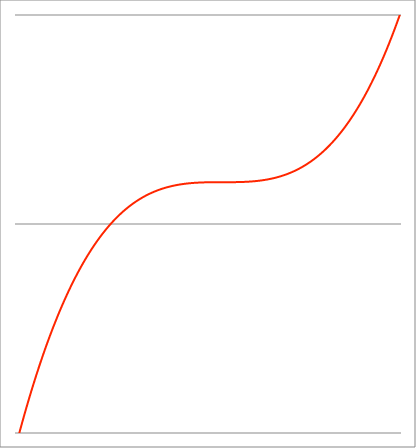
| Category | Series 1 |
|---|---|
| -1.08 | -1.06 |
| -1.07899 | -1.056 |
| -1.07798 | -1.053 |
| -1.07697 | -1.049 |
| -1.07596 | -1.046 |
| -1.07495 | -1.042 |
| -1.07394 | -1.039 |
| -1.07293 | -1.035 |
| -1.07192 | -1.032 |
| -1.07091 | -1.028 |
| -1.069900000000001 | -1.025 |
| -1.068890000000001 | -1.021 |
| -1.067880000000001 | -1.018 |
| -1.066870000000001 | -1.014 |
| -1.065860000000001 | -1.011 |
| -1.064850000000001 | -1.007 |
| -1.063840000000001 | -1.004 |
| -1.062830000000001 | -1.001 |
| -1.061820000000001 | -0.997 |
| -1.060810000000001 | -0.994 |
| -1.059800000000001 | -0.99 |
| -1.058790000000001 | -0.987 |
| -1.057780000000001 | -0.984 |
| -1.056770000000001 | -0.98 |
| -1.055760000000001 | -0.977 |
| -1.054750000000001 | -0.973 |
| -1.053740000000001 | -0.97 |
| -1.052730000000001 | -0.967 |
| -1.051720000000001 | -0.963 |
| -1.050710000000001 | -0.96 |
| -1.049700000000001 | -0.957 |
| -1.048690000000001 | -0.953 |
| -1.047680000000001 | -0.95 |
| -1.046670000000002 | -0.947 |
| -1.045660000000002 | -0.943 |
| -1.044650000000002 | -0.94 |
| -1.043640000000002 | -0.937 |
| -1.042630000000002 | -0.933 |
| -1.041620000000002 | -0.93 |
| -1.040610000000002 | -0.927 |
| -1.039600000000002 | -0.924 |
| -1.038590000000002 | -0.92 |
| -1.037580000000002 | -0.917 |
| -1.036570000000002 | -0.914 |
| -1.035560000000002 | -0.911 |
| -1.034550000000002 | -0.907 |
| -1.033540000000002 | -0.904 |
| -1.032530000000002 | -0.901 |
| -1.031520000000002 | -0.898 |
| -1.030510000000002 | -0.894 |
| -1.029500000000002 | -0.891 |
| -1.028490000000002 | -0.888 |
| -1.027480000000002 | -0.885 |
| -1.026470000000002 | -0.882 |
| -1.025460000000002 | -0.878 |
| -1.024450000000003 | -0.875 |
| -1.023440000000003 | -0.872 |
| -1.022430000000003 | -0.869 |
| -1.021420000000003 | -0.866 |
| -1.020410000000003 | -0.862 |
| -1.019400000000003 | -0.859 |
| -1.018390000000003 | -0.856 |
| -1.017380000000003 | -0.853 |
| -1.016370000000003 | -0.85 |
| -1.015360000000003 | -0.847 |
| -1.014350000000003 | -0.844 |
| -1.013340000000003 | -0.841 |
| -1.012330000000003 | -0.837 |
| -1.011320000000003 | -0.834 |
| -1.010310000000003 | -0.831 |
| -1.009300000000003 | -0.828 |
| -1.008290000000003 | -0.825 |
| -1.007280000000003 | -0.822 |
| -1.006270000000003 | -0.819 |
| -1.005260000000003 | -0.816 |
| -1.004250000000003 | -0.813 |
| -1.003240000000003 | -0.81 |
| -1.002230000000004 | -0.807 |
| -1.001220000000004 | -0.804 |
| -1.000210000000004 | -0.801 |
| -0.999200000000004 | -0.798 |
| -0.998190000000004 | -0.795 |
| -0.997180000000004 | -0.792 |
| -0.996170000000004 | -0.789 |
| -0.995160000000004 | -0.786 |
| -0.994150000000004 | -0.783 |
| -0.993140000000004 | -0.78 |
| -0.992130000000004 | -0.777 |
| -0.991120000000004 | -0.774 |
| -0.990110000000004 | -0.771 |
| -0.989100000000004 | -0.768 |
| -0.988090000000004 | -0.765 |
| -0.987080000000004 | -0.762 |
| -0.986070000000004 | -0.759 |
| -0.985060000000004 | -0.756 |
| -0.984050000000004 | -0.753 |
| -0.983040000000004 | -0.75 |
| -0.982030000000004 | -0.747 |
| -0.981020000000004 | -0.744 |
| -0.980010000000004 | -0.741 |
| -0.979000000000005 | -0.738 |
| -0.977990000000005 | -0.735 |
| -0.976980000000005 | -0.733 |
| -0.975970000000005 | -0.73 |
| -0.974960000000005 | -0.727 |
| -0.973950000000005 | -0.724 |
| -0.972940000000005 | -0.721 |
| -0.971930000000005 | -0.718 |
| -0.970920000000005 | -0.715 |
| -0.969910000000005 | -0.712 |
| -0.968900000000005 | -0.71 |
| -0.967890000000005 | -0.707 |
| -0.966880000000005 | -0.704 |
| -0.965870000000005 | -0.701 |
| -0.964860000000005 | -0.698 |
| -0.963850000000005 | -0.695 |
| -0.962840000000005 | -0.693 |
| -0.961830000000005 | -0.69 |
| -0.960820000000005 | -0.687 |
| -0.959810000000005 | -0.684 |
| -0.958800000000005 | -0.681 |
| -0.957790000000005 | -0.679 |
| -0.956780000000005 | -0.676 |
| -0.955770000000006 | -0.673 |
| -0.954760000000006 | -0.67 |
| -0.953750000000006 | -0.668 |
| -0.952740000000006 | -0.665 |
| -0.951730000000006 | -0.662 |
| -0.950720000000006 | -0.659 |
| -0.949710000000006 | -0.657 |
| -0.948700000000006 | -0.654 |
| -0.947690000000006 | -0.651 |
| -0.946680000000006 | -0.648 |
| -0.945670000000006 | -0.646 |
| -0.944660000000006 | -0.643 |
| -0.943650000000006 | -0.64 |
| -0.942640000000006 | -0.638 |
| -0.941630000000006 | -0.635 |
| -0.940620000000006 | -0.632 |
| -0.939610000000006 | -0.63 |
| -0.938600000000006 | -0.627 |
| -0.937590000000006 | -0.624 |
| -0.936580000000006 | -0.622 |
| -0.935570000000006 | -0.619 |
| -0.934560000000006 | -0.616 |
| -0.933550000000007 | -0.614 |
| -0.932540000000007 | -0.611 |
| -0.931530000000007 | -0.608 |
| -0.930520000000007 | -0.606 |
| -0.929510000000007 | -0.603 |
| -0.928500000000007 | -0.6 |
| -0.927490000000007 | -0.598 |
| -0.926480000000007 | -0.595 |
| -0.925470000000007 | -0.593 |
| -0.924460000000007 | -0.59 |
| -0.923450000000007 | -0.587 |
| -0.922440000000007 | -0.585 |
| -0.921430000000007 | -0.582 |
| -0.920420000000007 | -0.58 |
| -0.919410000000007 | -0.577 |
| -0.918400000000007 | -0.575 |
| -0.917390000000007 | -0.572 |
| -0.916380000000007 | -0.57 |
| -0.915370000000007 | -0.567 |
| -0.914360000000007 | -0.564 |
| -0.913350000000007 | -0.562 |
| -0.912340000000007 | -0.559 |
| -0.911330000000007 | -0.557 |
| -0.910320000000008 | -0.554 |
| -0.909310000000008 | -0.552 |
| -0.908300000000008 | -0.549 |
| -0.907290000000008 | -0.547 |
| -0.906280000000008 | -0.544 |
| -0.905270000000008 | -0.542 |
| -0.904260000000008 | -0.539 |
| -0.903250000000008 | -0.537 |
| -0.902240000000008 | -0.534 |
| -0.901230000000008 | -0.532 |
| -0.900220000000008 | -0.53 |
| -0.899210000000008 | -0.527 |
| -0.898200000000008 | -0.525 |
| -0.897190000000008 | -0.522 |
| -0.896180000000008 | -0.52 |
| -0.895170000000008 | -0.517 |
| -0.894160000000008 | -0.515 |
| -0.893150000000008 | -0.512 |
| -0.892140000000008 | -0.51 |
| -0.891130000000008 | -0.508 |
| -0.890120000000008 | -0.505 |
| -0.889110000000008 | -0.503 |
| -0.888100000000008 | -0.5 |
| -0.887090000000009 | -0.498 |
| -0.886080000000009 | -0.496 |
| -0.885070000000009 | -0.493 |
| -0.884060000000009 | -0.491 |
| -0.883050000000009 | -0.489 |
| -0.882040000000009 | -0.486 |
| -0.881030000000009 | -0.484 |
| -0.880020000000009 | -0.482 |
| -0.879010000000009 | -0.479 |
| -0.878000000000009 | -0.477 |
| -0.876990000000009 | -0.475 |
| -0.875980000000009 | -0.472 |
| -0.874970000000009 | -0.47 |
| -0.873960000000009 | -0.468 |
| -0.872950000000009 | -0.465 |
| -0.871940000000009 | -0.463 |
| -0.870930000000009 | -0.461 |
| -0.869920000000009 | -0.458 |
| -0.868910000000009 | -0.456 |
| -0.867900000000009 | -0.454 |
| -0.866890000000009 | -0.451 |
| -0.865880000000009 | -0.449 |
| -0.86487000000001 | -0.447 |
| -0.86386000000001 | -0.445 |
| -0.86285000000001 | -0.442 |
| -0.86184000000001 | -0.44 |
| -0.86083000000001 | -0.438 |
| -0.85982000000001 | -0.436 |
| -0.85881000000001 | -0.433 |
| -0.85780000000001 | -0.431 |
| -0.85679000000001 | -0.429 |
| -0.85578000000001 | -0.427 |
| -0.85477000000001 | -0.425 |
| -0.85376000000001 | -0.422 |
| -0.85275000000001 | -0.42 |
| -0.85174000000001 | -0.418 |
| -0.85073000000001 | -0.416 |
| -0.84972000000001 | -0.414 |
| -0.84871000000001 | -0.411 |
| -0.84770000000001 | -0.409 |
| -0.84669000000001 | -0.407 |
| -0.84568000000001 | -0.405 |
| -0.84467000000001 | -0.403 |
| -0.84366000000001 | -0.4 |
| -0.842650000000011 | -0.398 |
| -0.841640000000011 | -0.396 |
| -0.840630000000011 | -0.394 |
| -0.839620000000011 | -0.392 |
| -0.838610000000011 | -0.39 |
| -0.837600000000011 | -0.388 |
| -0.836590000000011 | -0.386 |
| -0.835580000000011 | -0.383 |
| -0.834570000000011 | -0.381 |
| -0.833560000000011 | -0.379 |
| -0.832550000000011 | -0.377 |
| -0.831540000000011 | -0.375 |
| -0.830530000000011 | -0.373 |
| -0.829520000000011 | -0.371 |
| -0.828510000000011 | -0.369 |
| -0.827500000000011 | -0.367 |
| -0.826490000000011 | -0.365 |
| -0.825480000000011 | -0.362 |
| -0.824470000000011 | -0.36 |
| -0.823460000000011 | -0.358 |
| -0.822450000000011 | -0.356 |
| -0.821440000000011 | -0.354 |
| -0.820430000000011 | -0.352 |
| -0.819420000000012 | -0.35 |
| -0.818410000000012 | -0.348 |
| -0.817400000000012 | -0.346 |
| -0.816390000000012 | -0.344 |
| -0.815380000000012 | -0.342 |
| -0.814370000000012 | -0.34 |
| -0.813360000000012 | -0.338 |
| -0.812350000000012 | -0.336 |
| -0.811340000000012 | -0.334 |
| -0.810330000000012 | -0.332 |
| -0.809320000000012 | -0.33 |
| -0.808310000000012 | -0.328 |
| -0.807300000000012 | -0.326 |
| -0.806290000000012 | -0.324 |
| -0.805280000000012 | -0.322 |
| -0.804270000000012 | -0.32 |
| -0.803260000000012 | -0.318 |
| -0.802250000000012 | -0.316 |
| -0.801240000000012 | -0.314 |
| -0.800230000000012 | -0.312 |
| -0.799220000000012 | -0.311 |
| -0.798210000000012 | -0.309 |
| -0.797200000000012 | -0.307 |
| -0.796190000000013 | -0.305 |
| -0.795180000000013 | -0.303 |
| -0.794170000000013 | -0.301 |
| -0.793160000000013 | -0.299 |
| -0.792150000000013 | -0.297 |
| -0.791140000000013 | -0.295 |
| -0.790130000000013 | -0.293 |
| -0.789120000000013 | -0.291 |
| -0.788110000000013 | -0.29 |
| -0.787100000000013 | -0.288 |
| -0.786090000000013 | -0.286 |
| -0.785080000000013 | -0.284 |
| -0.784070000000013 | -0.282 |
| -0.783060000000013 | -0.28 |
| -0.782050000000013 | -0.278 |
| -0.781040000000013 | -0.276 |
| -0.780030000000013 | -0.275 |
| -0.779020000000013 | -0.273 |
| -0.778010000000013 | -0.271 |
| -0.777000000000013 | -0.269 |
| -0.775990000000013 | -0.267 |
| -0.774980000000013 | -0.265 |
| -0.773970000000014 | -0.264 |
| -0.772960000000014 | -0.262 |
| -0.771950000000014 | -0.26 |
| -0.770940000000014 | -0.258 |
| -0.769930000000014 | -0.256 |
| -0.768920000000014 | -0.255 |
| -0.767910000000014 | -0.253 |
| -0.766900000000014 | -0.251 |
| -0.765890000000014 | -0.249 |
| -0.764880000000014 | -0.247 |
| -0.763870000000014 | -0.246 |
| -0.762860000000014 | -0.244 |
| -0.761850000000014 | -0.242 |
| -0.760840000000014 | -0.24 |
| -0.759830000000014 | -0.239 |
| -0.758820000000014 | -0.237 |
| -0.757810000000014 | -0.235 |
| -0.756800000000014 | -0.233 |
| -0.755790000000014 | -0.232 |
| -0.754780000000014 | -0.23 |
| -0.753770000000014 | -0.228 |
| -0.752760000000014 | -0.227 |
| -0.751750000000014 | -0.225 |
| -0.750740000000015 | -0.223 |
| -0.749730000000015 | -0.221 |
| -0.748720000000015 | -0.22 |
| -0.747710000000015 | -0.218 |
| -0.746700000000015 | -0.216 |
| -0.745690000000015 | -0.215 |
| -0.744680000000015 | -0.213 |
| -0.743670000000015 | -0.211 |
| -0.742660000000015 | -0.21 |
| -0.741650000000015 | -0.208 |
| -0.740640000000015 | -0.206 |
| -0.739630000000015 | -0.205 |
| -0.738620000000015 | -0.203 |
| -0.737610000000015 | -0.201 |
| -0.736600000000015 | -0.2 |
| -0.735590000000015 | -0.198 |
| -0.734580000000015 | -0.196 |
| -0.733570000000015 | -0.195 |
| -0.732560000000015 | -0.193 |
| -0.731550000000015 | -0.192 |
| -0.730540000000015 | -0.19 |
| -0.729530000000015 | -0.188 |
| -0.728520000000016 | -0.187 |
| -0.727510000000016 | -0.185 |
| -0.726500000000016 | -0.183 |
| -0.725490000000016 | -0.182 |
| -0.724480000000016 | -0.18 |
| -0.723470000000016 | -0.179 |
| -0.722460000000016 | -0.177 |
| -0.721450000000016 | -0.176 |
| -0.720440000000016 | -0.174 |
| -0.719430000000016 | -0.172 |
| -0.718420000000016 | -0.171 |
| -0.717410000000016 | -0.169 |
| -0.716400000000016 | -0.168 |
| -0.715390000000016 | -0.166 |
| -0.714380000000016 | -0.165 |
| -0.713370000000016 | -0.163 |
| -0.712360000000016 | -0.161 |
| -0.711350000000016 | -0.16 |
| -0.710340000000016 | -0.158 |
| -0.709330000000016 | -0.157 |
| -0.708320000000016 | -0.155 |
| -0.707310000000016 | -0.154 |
| -0.706300000000017 | -0.152 |
| -0.705290000000017 | -0.151 |
| -0.704280000000017 | -0.149 |
| -0.703270000000017 | -0.148 |
| -0.702260000000017 | -0.146 |
| -0.701250000000017 | -0.145 |
| -0.700240000000017 | -0.143 |
| -0.699230000000017 | -0.142 |
| -0.698220000000017 | -0.14 |
| -0.697210000000017 | -0.139 |
| -0.696200000000017 | -0.137 |
| -0.695190000000017 | -0.136 |
| -0.694180000000017 | -0.135 |
| -0.693170000000017 | -0.133 |
| -0.692160000000017 | -0.132 |
| -0.691150000000017 | -0.13 |
| -0.690140000000017 | -0.129 |
| -0.689130000000017 | -0.127 |
| -0.688120000000017 | -0.126 |
| -0.687110000000017 | -0.124 |
| -0.686100000000017 | -0.123 |
| -0.685090000000017 | -0.122 |
| -0.684080000000017 | -0.12 |
| -0.683070000000018 | -0.119 |
| -0.682060000000018 | -0.117 |
| -0.681050000000018 | -0.116 |
| -0.680040000000018 | -0.114 |
| -0.679030000000018 | -0.113 |
| -0.678020000000018 | -0.112 |
| -0.677010000000018 | -0.11 |
| -0.676000000000018 | -0.109 |
| -0.674990000000018 | -0.108 |
| -0.673980000000018 | -0.106 |
| -0.672970000000018 | -0.105 |
| -0.671960000000018 | -0.103 |
| -0.670950000000018 | -0.102 |
| -0.669940000000018 | -0.101 |
| -0.668930000000018 | -0.099 |
| -0.667920000000018 | -0.098 |
| -0.666910000000018 | -0.097 |
| -0.665900000000018 | -0.095 |
| -0.664890000000018 | -0.094 |
| -0.663880000000018 | -0.093 |
| -0.662870000000018 | -0.091 |
| -0.661860000000018 | -0.09 |
| -0.660850000000018 | -0.089 |
| -0.659840000000019 | -0.087 |
| -0.658830000000019 | -0.086 |
| -0.657820000000019 | -0.085 |
| -0.656810000000019 | -0.083 |
| -0.655800000000019 | -0.082 |
| -0.654790000000019 | -0.081 |
| -0.653780000000019 | -0.079 |
| -0.652770000000019 | -0.078 |
| -0.651760000000019 | -0.077 |
| -0.650750000000019 | -0.076 |
| -0.649740000000019 | -0.074 |
| -0.648730000000019 | -0.073 |
| -0.647720000000019 | -0.072 |
| -0.646710000000019 | -0.07 |
| -0.645700000000019 | -0.069 |
| -0.644690000000019 | -0.068 |
| -0.643680000000019 | -0.067 |
| -0.642670000000019 | -0.065 |
| -0.641660000000019 | -0.064 |
| -0.640650000000019 | -0.063 |
| -0.639640000000019 | -0.062 |
| -0.638630000000019 | -0.06 |
| -0.63762000000002 | -0.059 |
| -0.63661000000002 | -0.058 |
| -0.63560000000002 | -0.057 |
| -0.63459000000002 | -0.056 |
| -0.63358000000002 | -0.054 |
| -0.63257000000002 | -0.053 |
| -0.63156000000002 | -0.052 |
| -0.63055000000002 | -0.051 |
| -0.62954000000002 | -0.049 |
| -0.62853000000002 | -0.048 |
| -0.62752000000002 | -0.047 |
| -0.62651000000002 | -0.046 |
| -0.62550000000002 | -0.045 |
| -0.62449000000002 | -0.044 |
| -0.62348000000002 | -0.042 |
| -0.62247000000002 | -0.041 |
| -0.62146000000002 | -0.04 |
| -0.62045000000002 | -0.039 |
| -0.61944000000002 | -0.038 |
| -0.61843000000002 | -0.037 |
| -0.61742000000002 | -0.035 |
| -0.61641000000002 | -0.034 |
| -0.615400000000021 | -0.033 |
| -0.614390000000021 | -0.032 |
| -0.613380000000021 | -0.031 |
| -0.612370000000021 | -0.03 |
| -0.611360000000021 | -0.029 |
| -0.610350000000021 | -0.027 |
| -0.609340000000021 | -0.026 |
| -0.608330000000021 | -0.025 |
| -0.607320000000021 | -0.024 |
| -0.606310000000021 | -0.023 |
| -0.605300000000021 | -0.022 |
| -0.604290000000021 | -0.021 |
| -0.603280000000021 | -0.02 |
| -0.602270000000021 | -0.018 |
| -0.601260000000021 | -0.017 |
| -0.600250000000021 | -0.016 |
| -0.599240000000021 | -0.015 |
| -0.598230000000021 | -0.014 |
| -0.597220000000021 | -0.013 |
| -0.596210000000021 | -0.012 |
| -0.595200000000021 | -0.011 |
| -0.594190000000022 | -0.01 |
| -0.593180000000022 | -0.009 |
| -0.592170000000022 | -0.008 |
| -0.591160000000022 | -0.007 |
| -0.590150000000022 | -0.006 |
| -0.589140000000022 | -0.004 |
| -0.588130000000022 | -0.003 |
| -0.587120000000022 | -0.002 |
| -0.586110000000022 | -0.001 |
| -0.585100000000022 | 0 |
| -0.584090000000022 | 0.001 |
| -0.583080000000022 | 0.002 |
| -0.582070000000022 | 0.003 |
| -0.581060000000022 | 0.004 |
| -0.580050000000022 | 0.005 |
| -0.579040000000022 | 0.006 |
| -0.578030000000022 | 0.007 |
| -0.577020000000022 | 0.008 |
| -0.576010000000022 | 0.009 |
| -0.575000000000022 | 0.01 |
| -0.573990000000022 | 0.011 |
| -0.572980000000022 | 0.012 |
| -0.571970000000023 | 0.013 |
| -0.570960000000023 | 0.014 |
| -0.569950000000023 | 0.015 |
| -0.568940000000023 | 0.016 |
| -0.567930000000023 | 0.017 |
| -0.566920000000023 | 0.018 |
| -0.565910000000023 | 0.019 |
| -0.564900000000023 | 0.02 |
| -0.563890000000023 | 0.021 |
| -0.562880000000023 | 0.022 |
| -0.561870000000023 | 0.023 |
| -0.560860000000023 | 0.024 |
| -0.559850000000023 | 0.025 |
| -0.558840000000023 | 0.025 |
| -0.557830000000023 | 0.026 |
| -0.556820000000023 | 0.027 |
| -0.555810000000023 | 0.028 |
| -0.554800000000023 | 0.029 |
| -0.553790000000023 | 0.03 |
| -0.552780000000023 | 0.031 |
| -0.551770000000023 | 0.032 |
| -0.550760000000023 | 0.033 |
| -0.549750000000023 | 0.034 |
| -0.548740000000024 | 0.035 |
| -0.547730000000024 | 0.036 |
| -0.546720000000024 | 0.037 |
| -0.545710000000024 | 0.037 |
| -0.544700000000024 | 0.038 |
| -0.543690000000024 | 0.039 |
| -0.542680000000024 | 0.04 |
| -0.541670000000024 | 0.041 |
| -0.540660000000024 | 0.042 |
| -0.539650000000024 | 0.043 |
| -0.538640000000024 | 0.044 |
| -0.537630000000024 | 0.045 |
| -0.536620000000024 | 0.045 |
| -0.535610000000024 | 0.046 |
| -0.534600000000024 | 0.047 |
| -0.533590000000024 | 0.048 |
| -0.532580000000024 | 0.049 |
| -0.531570000000024 | 0.05 |
| -0.530560000000024 | 0.051 |
| -0.529550000000024 | 0.052 |
| -0.528540000000024 | 0.052 |
| -0.527530000000024 | 0.053 |
| -0.526520000000025 | 0.054 |
| -0.525510000000025 | 0.055 |
| -0.524500000000025 | 0.056 |
| -0.523490000000025 | 0.057 |
| -0.522480000000025 | 0.057 |
| -0.521470000000025 | 0.058 |
| -0.520460000000025 | 0.059 |
| -0.519450000000025 | 0.06 |
| -0.518440000000025 | 0.061 |
| -0.517430000000025 | 0.061 |
| -0.516420000000025 | 0.062 |
| -0.515410000000025 | 0.063 |
| -0.514400000000025 | 0.064 |
| -0.513390000000025 | 0.065 |
| -0.512380000000025 | 0.065 |
| -0.511370000000025 | 0.066 |
| -0.510360000000025 | 0.067 |
| -0.509350000000025 | 0.068 |
| -0.508340000000025 | 0.069 |
| -0.507330000000025 | 0.069 |
| -0.506320000000025 | 0.07 |
| -0.505310000000025 | 0.071 |
| -0.504300000000026 | 0.072 |
| -0.503290000000026 | 0.073 |
| -0.502280000000026 | 0.073 |
| -0.501270000000026 | 0.074 |
| -0.500260000000026 | 0.075 |
| -0.499250000000026 | 0.076 |
| -0.498240000000026 | 0.076 |
| -0.497230000000026 | 0.077 |
| -0.496220000000026 | 0.078 |
| -0.495210000000026 | 0.079 |
| -0.494200000000026 | 0.079 |
| -0.493190000000026 | 0.08 |
| -0.492180000000026 | 0.081 |
| -0.491170000000026 | 0.082 |
| -0.490160000000026 | 0.082 |
| -0.489150000000026 | 0.083 |
| -0.488140000000026 | 0.084 |
| -0.487130000000026 | 0.084 |
| -0.486120000000025 | 0.085 |
| -0.485110000000025 | 0.086 |
| -0.484100000000025 | 0.087 |
| -0.483090000000025 | 0.087 |
| -0.482080000000025 | 0.088 |
| -0.481070000000025 | 0.089 |
| -0.480060000000025 | 0.089 |
| -0.479050000000025 | 0.09 |
| -0.478040000000025 | 0.091 |
| -0.477030000000025 | 0.091 |
| -0.476020000000025 | 0.092 |
| -0.475010000000025 | 0.093 |
| -0.474000000000025 | 0.094 |
| -0.472990000000025 | 0.094 |
| -0.471980000000025 | 0.095 |
| -0.470970000000025 | 0.096 |
| -0.469960000000025 | 0.096 |
| -0.468950000000025 | 0.097 |
| -0.467940000000025 | 0.098 |
| -0.466930000000025 | 0.098 |
| -0.465920000000025 | 0.099 |
| -0.464910000000025 | 0.1 |
| -0.463900000000025 | 0.1 |
| -0.462890000000025 | 0.101 |
| -0.461880000000025 | 0.101 |
| -0.460870000000025 | 0.102 |
| -0.459860000000025 | 0.103 |
| -0.458850000000025 | 0.103 |
| -0.457840000000025 | 0.104 |
| -0.456830000000025 | 0.105 |
| -0.455820000000025 | 0.105 |
| -0.454810000000025 | 0.106 |
| -0.453800000000025 | 0.107 |
| -0.452790000000025 | 0.107 |
| -0.451780000000025 | 0.108 |
| -0.450770000000025 | 0.108 |
| -0.449760000000025 | 0.109 |
| -0.448750000000025 | 0.11 |
| -0.447740000000025 | 0.11 |
| -0.446730000000025 | 0.111 |
| -0.445720000000025 | 0.111 |
| -0.444710000000025 | 0.112 |
| -0.443700000000025 | 0.113 |
| -0.442690000000025 | 0.113 |
| -0.441680000000025 | 0.114 |
| -0.440670000000025 | 0.114 |
| -0.439660000000025 | 0.115 |
| -0.438650000000025 | 0.116 |
| -0.437640000000025 | 0.116 |
| -0.436630000000025 | 0.117 |
| -0.435620000000025 | 0.117 |
| -0.434610000000025 | 0.118 |
| -0.433600000000025 | 0.118 |
| -0.432590000000025 | 0.119 |
| -0.431580000000025 | 0.12 |
| -0.430570000000025 | 0.12 |
| -0.429560000000025 | 0.121 |
| -0.428550000000025 | 0.121 |
| -0.427540000000025 | 0.122 |
| -0.426530000000025 | 0.122 |
| -0.425520000000025 | 0.123 |
| -0.424510000000025 | 0.123 |
| -0.423500000000025 | 0.124 |
| -0.422490000000025 | 0.125 |
| -0.421480000000025 | 0.125 |
| -0.420470000000025 | 0.126 |
| -0.419460000000025 | 0.126 |
| -0.418450000000025 | 0.127 |
| -0.417440000000025 | 0.127 |
| -0.416430000000025 | 0.128 |
| -0.415420000000025 | 0.128 |
| -0.414410000000025 | 0.129 |
| -0.413400000000025 | 0.129 |
| -0.412390000000025 | 0.13 |
| -0.411380000000025 | 0.13 |
| -0.410370000000025 | 0.131 |
| -0.409360000000025 | 0.131 |
| -0.408350000000025 | 0.132 |
| -0.407340000000025 | 0.132 |
| -0.406330000000025 | 0.133 |
| -0.405320000000025 | 0.133 |
| -0.404310000000025 | 0.134 |
| -0.403300000000025 | 0.134 |
| -0.402290000000025 | 0.135 |
| -0.401280000000025 | 0.135 |
| -0.400270000000025 | 0.136 |
| -0.399260000000025 | 0.136 |
| -0.398250000000025 | 0.137 |
| -0.397240000000025 | 0.137 |
| -0.396230000000024 | 0.138 |
| -0.395220000000024 | 0.138 |
| -0.394210000000024 | 0.139 |
| -0.393200000000024 | 0.139 |
| -0.392190000000024 | 0.14 |
| -0.391180000000024 | 0.14 |
| -0.390170000000024 | 0.141 |
| -0.389160000000024 | 0.141 |
| -0.388150000000024 | 0.142 |
| -0.387140000000024 | 0.142 |
| -0.386130000000024 | 0.142 |
| -0.385120000000024 | 0.143 |
| -0.384110000000024 | 0.143 |
| -0.383100000000024 | 0.144 |
| -0.382090000000024 | 0.144 |
| -0.381080000000024 | 0.145 |
| -0.380070000000024 | 0.145 |
| -0.379060000000024 | 0.146 |
| -0.378050000000024 | 0.146 |
| -0.377040000000024 | 0.146 |
| -0.376030000000024 | 0.147 |
| -0.375020000000024 | 0.147 |
| -0.374010000000024 | 0.148 |
| -0.373000000000024 | 0.148 |
| -0.371990000000024 | 0.149 |
| -0.370980000000024 | 0.149 |
| -0.369970000000024 | 0.149 |
| -0.368960000000024 | 0.15 |
| -0.367950000000024 | 0.15 |
| -0.366940000000024 | 0.151 |
| -0.365930000000024 | 0.151 |
| -0.364920000000024 | 0.151 |
| -0.363910000000024 | 0.152 |
| -0.362900000000024 | 0.152 |
| -0.361890000000024 | 0.153 |
| -0.360880000000024 | 0.153 |
| -0.359870000000024 | 0.153 |
| -0.358860000000024 | 0.154 |
| -0.357850000000024 | 0.154 |
| -0.356840000000024 | 0.155 |
| -0.355830000000024 | 0.155 |
| -0.354820000000024 | 0.155 |
| -0.353810000000024 | 0.156 |
| -0.352800000000024 | 0.156 |
| -0.351790000000024 | 0.156 |
| -0.350780000000024 | 0.157 |
| -0.349770000000024 | 0.157 |
| -0.348760000000024 | 0.158 |
| -0.347750000000024 | 0.158 |
| -0.346740000000024 | 0.158 |
| -0.345730000000024 | 0.159 |
| -0.344720000000024 | 0.159 |
| -0.343710000000024 | 0.159 |
| -0.342700000000024 | 0.16 |
| -0.341690000000024 | 0.16 |
| -0.340680000000024 | 0.16 |
| -0.339670000000024 | 0.161 |
| -0.338660000000024 | 0.161 |
| -0.337650000000024 | 0.162 |
| -0.336640000000024 | 0.162 |
| -0.335630000000024 | 0.162 |
| -0.334620000000024 | 0.163 |
| -0.333610000000024 | 0.163 |
| -0.332600000000024 | 0.163 |
| -0.331590000000024 | 0.164 |
| -0.330580000000024 | 0.164 |
| -0.329570000000024 | 0.164 |
| -0.328560000000024 | 0.165 |
| -0.327550000000024 | 0.165 |
| -0.326540000000024 | 0.165 |
| -0.325530000000024 | 0.166 |
| -0.324520000000024 | 0.166 |
| -0.323510000000024 | 0.166 |
| -0.322500000000024 | 0.166 |
| -0.321490000000024 | 0.167 |
| -0.320480000000024 | 0.167 |
| -0.319470000000024 | 0.167 |
| -0.318460000000024 | 0.168 |
| -0.317450000000024 | 0.168 |
| -0.316440000000024 | 0.168 |
| -0.315430000000024 | 0.169 |
| -0.314420000000024 | 0.169 |
| -0.313410000000024 | 0.169 |
| -0.312400000000024 | 0.17 |
| -0.311390000000024 | 0.17 |
| -0.310380000000024 | 0.17 |
| -0.309370000000024 | 0.17 |
| -0.308360000000024 | 0.171 |
| -0.307350000000024 | 0.171 |
| -0.306340000000024 | 0.171 |
| -0.305330000000024 | 0.172 |
| -0.304320000000024 | 0.172 |
| -0.303310000000024 | 0.172 |
| -0.302300000000024 | 0.172 |
| -0.301290000000023 | 0.173 |
| -0.300280000000023 | 0.173 |
| -0.299270000000023 | 0.173 |
| -0.298260000000023 | 0.173 |
| -0.297250000000023 | 0.174 |
| -0.296240000000023 | 0.174 |
| -0.295230000000023 | 0.174 |
| -0.294220000000023 | 0.175 |
| -0.293210000000023 | 0.175 |
| -0.292200000000023 | 0.175 |
| -0.291190000000023 | 0.175 |
| -0.290180000000023 | 0.176 |
| -0.289170000000023 | 0.176 |
| -0.288160000000023 | 0.176 |
| -0.287150000000023 | 0.176 |
| -0.286140000000023 | 0.177 |
| -0.285130000000023 | 0.177 |
| -0.284120000000023 | 0.177 |
| -0.283110000000023 | 0.177 |
| -0.282100000000023 | 0.178 |
| -0.281090000000023 | 0.178 |
| -0.280080000000023 | 0.178 |
| -0.279070000000023 | 0.178 |
| -0.278060000000023 | 0.179 |
| -0.277050000000023 | 0.179 |
| -0.276040000000023 | 0.179 |
| -0.275030000000023 | 0.179 |
| -0.274020000000023 | 0.179 |
| -0.273010000000023 | 0.18 |
| -0.272000000000023 | 0.18 |
| -0.270990000000023 | 0.18 |
| -0.269980000000023 | 0.18 |
| -0.268970000000023 | 0.181 |
| -0.267960000000023 | 0.181 |
| -0.266950000000023 | 0.181 |
| -0.265940000000023 | 0.181 |
| -0.264930000000023 | 0.181 |
| -0.263920000000023 | 0.182 |
| -0.262910000000023 | 0.182 |
| -0.261900000000023 | 0.182 |
| -0.260890000000023 | 0.182 |
| -0.259880000000023 | 0.182 |
| -0.258870000000023 | 0.183 |
| -0.257860000000023 | 0.183 |
| -0.256850000000023 | 0.183 |
| -0.255840000000023 | 0.183 |
| -0.254830000000023 | 0.183 |
| -0.253820000000023 | 0.184 |
| -0.252810000000023 | 0.184 |
| -0.251800000000023 | 0.184 |
| -0.250790000000023 | 0.184 |
| -0.249780000000023 | 0.184 |
| -0.248770000000023 | 0.185 |
| -0.247760000000023 | 0.185 |
| -0.246750000000023 | 0.185 |
| -0.245740000000023 | 0.185 |
| -0.244730000000023 | 0.185 |
| -0.243720000000023 | 0.186 |
| -0.242710000000023 | 0.186 |
| -0.241700000000023 | 0.186 |
| -0.240690000000023 | 0.186 |
| -0.239680000000023 | 0.186 |
| -0.238670000000023 | 0.186 |
| -0.237660000000023 | 0.187 |
| -0.236650000000023 | 0.187 |
| -0.235640000000023 | 0.187 |
| -0.234630000000023 | 0.187 |
| -0.233620000000023 | 0.187 |
| -0.232610000000023 | 0.187 |
| -0.231600000000023 | 0.188 |
| -0.230590000000023 | 0.188 |
| -0.229580000000023 | 0.188 |
| -0.228570000000023 | 0.188 |
| -0.227560000000023 | 0.188 |
| -0.226550000000023 | 0.188 |
| -0.225540000000023 | 0.189 |
| -0.224530000000023 | 0.189 |
| -0.223520000000023 | 0.189 |
| -0.222510000000023 | 0.189 |
| -0.221500000000023 | 0.189 |
| -0.220490000000023 | 0.189 |
| -0.219480000000023 | 0.189 |
| -0.218470000000023 | 0.19 |
| -0.217460000000023 | 0.19 |
| -0.216450000000023 | 0.19 |
| -0.215440000000023 | 0.19 |
| -0.214430000000023 | 0.19 |
| -0.213420000000023 | 0.19 |
| -0.212410000000023 | 0.19 |
| -0.211400000000023 | 0.191 |
| -0.210390000000023 | 0.191 |
| -0.209380000000023 | 0.191 |
| -0.208370000000023 | 0.191 |
| -0.207360000000023 | 0.191 |
| -0.206350000000023 | 0.191 |
| -0.205340000000022 | 0.191 |
| -0.204330000000022 | 0.191 |
| -0.203320000000022 | 0.192 |
| -0.202310000000022 | 0.192 |
| -0.201300000000022 | 0.192 |
| -0.200290000000022 | 0.192 |
| -0.199280000000022 | 0.192 |
| -0.198270000000022 | 0.192 |
| -0.197260000000022 | 0.192 |
| -0.196250000000022 | 0.192 |
| -0.195240000000022 | 0.193 |
| -0.194230000000022 | 0.193 |
| -0.193220000000022 | 0.193 |
| -0.192210000000022 | 0.193 |
| -0.191200000000022 | 0.193 |
| -0.190190000000022 | 0.193 |
| -0.189180000000022 | 0.193 |
| -0.188170000000022 | 0.193 |
| -0.187160000000022 | 0.193 |
| -0.186150000000022 | 0.194 |
| -0.185140000000022 | 0.194 |
| -0.184130000000022 | 0.194 |
| -0.183120000000022 | 0.194 |
| -0.182110000000022 | 0.194 |
| -0.181100000000022 | 0.194 |
| -0.180090000000022 | 0.194 |
| -0.179080000000022 | 0.194 |
| -0.178070000000022 | 0.194 |
| -0.177060000000022 | 0.194 |
| -0.176050000000022 | 0.195 |
| -0.175040000000022 | 0.195 |
| -0.174030000000022 | 0.195 |
| -0.173020000000022 | 0.195 |
| -0.172010000000022 | 0.195 |
| -0.171000000000022 | 0.195 |
| -0.169990000000022 | 0.195 |
| -0.168980000000022 | 0.195 |
| -0.167970000000022 | 0.195 |
| -0.166960000000022 | 0.195 |
| -0.165950000000022 | 0.195 |
| -0.164940000000022 | 0.196 |
| -0.163930000000022 | 0.196 |
| -0.162920000000022 | 0.196 |
| -0.161910000000022 | 0.196 |
| -0.160900000000022 | 0.196 |
| -0.159890000000022 | 0.196 |
| -0.158880000000022 | 0.196 |
| -0.157870000000022 | 0.196 |
| -0.156860000000022 | 0.196 |
| -0.155850000000022 | 0.196 |
| -0.154840000000022 | 0.196 |
| -0.153830000000022 | 0.196 |
| -0.152820000000022 | 0.196 |
| -0.151810000000022 | 0.197 |
| -0.150800000000022 | 0.197 |
| -0.149790000000022 | 0.197 |
| -0.148780000000022 | 0.197 |
| -0.147770000000022 | 0.197 |
| -0.146760000000022 | 0.197 |
| -0.145750000000022 | 0.197 |
| -0.144740000000022 | 0.197 |
| -0.143730000000022 | 0.197 |
| -0.142720000000022 | 0.197 |
| -0.141710000000022 | 0.197 |
| -0.140700000000022 | 0.197 |
| -0.139690000000022 | 0.197 |
| -0.138680000000022 | 0.197 |
| -0.137670000000022 | 0.197 |
| -0.136660000000022 | 0.197 |
| -0.135650000000022 | 0.198 |
| -0.134640000000022 | 0.198 |
| -0.133630000000022 | 0.198 |
| -0.132620000000022 | 0.198 |
| -0.131610000000022 | 0.198 |
| -0.130600000000022 | 0.198 |
| -0.129590000000022 | 0.198 |
| -0.128580000000022 | 0.198 |
| -0.127570000000022 | 0.198 |
| -0.126560000000022 | 0.198 |
| -0.125550000000022 | 0.198 |
| -0.124540000000022 | 0.198 |
| -0.123530000000022 | 0.198 |
| -0.122520000000022 | 0.198 |
| -0.121510000000022 | 0.198 |
| -0.120500000000022 | 0.198 |
| -0.119490000000022 | 0.198 |
| -0.118480000000022 | 0.198 |
| -0.117470000000022 | 0.198 |
| -0.116460000000022 | 0.198 |
| -0.115450000000022 | 0.198 |
| -0.114440000000022 | 0.199 |
| -0.113430000000022 | 0.199 |
| -0.112420000000022 | 0.199 |
| -0.111410000000022 | 0.199 |
| -0.110400000000022 | 0.199 |
| -0.109390000000022 | 0.199 |
| -0.108380000000022 | 0.199 |
| -0.107370000000022 | 0.199 |
| -0.106360000000022 | 0.199 |
| -0.105350000000022 | 0.199 |
| -0.104340000000022 | 0.199 |
| -0.103330000000022 | 0.199 |
| -0.102320000000022 | 0.199 |
| -0.101310000000022 | 0.199 |
| -0.100300000000022 | 0.199 |
| -0.0992900000000217 | 0.199 |
| -0.0982800000000217 | 0.199 |
| -0.0972700000000217 | 0.199 |
| -0.0962600000000217 | 0.199 |
| -0.0952500000000217 | 0.199 |
| -0.0942400000000217 | 0.199 |
| -0.0932300000000217 | 0.199 |
| -0.0922200000000217 | 0.199 |
| -0.0912100000000217 | 0.199 |
| -0.0902000000000217 | 0.199 |
| -0.0891900000000217 | 0.199 |
| -0.0881800000000217 | 0.199 |
| -0.0871700000000217 | 0.199 |
| -0.0861600000000217 | 0.199 |
| -0.0851500000000217 | 0.199 |
| -0.0841400000000218 | 0.199 |
| -0.0831300000000218 | 0.199 |
| -0.0821200000000218 | 0.199 |
| -0.0811100000000218 | 0.199 |
| -0.0801000000000218 | 0.199 |
| -0.0790900000000218 | 0.2 |
| -0.0780800000000218 | 0.2 |
| -0.0770700000000218 | 0.2 |
| -0.0760600000000218 | 0.2 |
| -0.0750500000000218 | 0.2 |
| -0.0740400000000218 | 0.2 |
| -0.0730300000000218 | 0.2 |
| -0.0720200000000218 | 0.2 |
| -0.0710100000000218 | 0.2 |
| -0.0700000000000218 | 0.2 |
| -0.0689900000000218 | 0.2 |
| -0.0679800000000218 | 0.2 |
| -0.0669700000000218 | 0.2 |
| -0.0659600000000218 | 0.2 |
| -0.0649500000000218 | 0.2 |
| -0.0639400000000218 | 0.2 |
| -0.0629300000000218 | 0.2 |
| -0.0619200000000218 | 0.2 |
| -0.0609100000000218 | 0.2 |
| -0.0599000000000218 | 0.2 |
| -0.0588900000000218 | 0.2 |
| -0.0578800000000218 | 0.2 |
| -0.0568700000000218 | 0.2 |
| -0.0558600000000218 | 0.2 |
| -0.0548500000000218 | 0.2 |
| -0.0538400000000218 | 0.2 |
| -0.0528300000000218 | 0.2 |
| -0.0518200000000219 | 0.2 |
| -0.0508100000000219 | 0.2 |
| -0.0498000000000219 | 0.2 |
| -0.0487900000000219 | 0.2 |
| -0.0477800000000219 | 0.2 |
| -0.0467700000000219 | 0.2 |
| -0.0457600000000219 | 0.2 |
| -0.0447500000000219 | 0.2 |
| -0.0437400000000219 | 0.2 |
| -0.0427300000000219 | 0.2 |
| -0.0417200000000219 | 0.2 |
| -0.0407100000000219 | 0.2 |
| -0.0397000000000219 | 0.2 |
| -0.0386900000000219 | 0.2 |
| -0.0376800000000219 | 0.2 |
| -0.0366700000000219 | 0.2 |
| -0.0356600000000219 | 0.2 |
| -0.0346500000000219 | 0.2 |
| -0.0336400000000219 | 0.2 |
| -0.0326300000000219 | 0.2 |
| -0.0316200000000219 | 0.2 |
| -0.0306100000000219 | 0.2 |
| -0.0296000000000219 | 0.2 |
| -0.0285900000000219 | 0.2 |
| -0.0275800000000219 | 0.2 |
| -0.0265700000000219 | 0.2 |
| -0.0255600000000219 | 0.2 |
| -0.0245500000000219 | 0.2 |
| -0.0235400000000219 | 0.2 |
| -0.0225300000000219 | 0.2 |
| -0.0215200000000219 | 0.2 |
| -0.0205100000000219 | 0.2 |
| -0.0195000000000219 | 0.2 |
| -0.0184900000000219 | 0.2 |
| -0.0174800000000219 | 0.2 |
| -0.0164700000000219 | 0.2 |
| -0.0154600000000219 | 0.2 |
| -0.0144500000000219 | 0.2 |
| -0.0134400000000219 | 0.2 |
| -0.0124300000000219 | 0.2 |
| -0.0114200000000219 | 0.2 |
| -0.0104100000000219 | 0.2 |
| -0.00940000000002191 | 0.2 |
| -0.00839000000002191 | 0.2 |
| -0.00738000000002191 | 0.2 |
| -0.00637000000002191 | 0.2 |
| -0.00536000000002191 | 0.2 |
| -0.00435000000002191 | 0.2 |
| -0.00334000000002191 | 0.2 |
| -0.00233000000002191 | 0.2 |
| -0.00132000000002191 | 0.2 |
| -0.000310000000021909 | 0.2 |
| 0.000699999999978091 | 0.2 |
| 0.00170999999997809 | 0.2 |
| 0.00271999999997809 | 0.2 |
| 0.00372999999997809 | 0.2 |
| 0.00473999999997809 | 0.2 |
| 0.00574999999997809 | 0.2 |
| 0.00675999999997809 | 0.2 |
| 0.00776999999997809 | 0.2 |
| 0.00877999999997809 | 0.2 |
| 0.00978999999997809 | 0.2 |
| 0.0107999999999781 | 0.2 |
| 0.0118099999999781 | 0.2 |
| 0.0128199999999781 | 0.2 |
| 0.0138299999999781 | 0.2 |
| 0.0148399999999781 | 0.2 |
| 0.0158499999999781 | 0.2 |
| 0.0168599999999781 | 0.2 |
| 0.0178699999999781 | 0.2 |
| 0.0188799999999781 | 0.2 |
| 0.0198899999999781 | 0.2 |
| 0.0208999999999781 | 0.2 |
| 0.0219099999999781 | 0.2 |
| 0.0229199999999781 | 0.2 |
| 0.0239299999999781 | 0.2 |
| 0.0249399999999781 | 0.2 |
| 0.0259499999999781 | 0.2 |
| 0.0269599999999781 | 0.2 |
| 0.0279699999999781 | 0.2 |
| 0.0289799999999781 | 0.2 |
| 0.0299899999999781 | 0.2 |
| 0.0309999999999781 | 0.2 |
| 0.0320099999999781 | 0.2 |
| 0.0330199999999781 | 0.2 |
| 0.0340299999999781 | 0.2 |
| 0.0350399999999781 | 0.2 |
| 0.0360499999999781 | 0.2 |
| 0.0370599999999781 | 0.2 |
| 0.0380699999999781 | 0.2 |
| 0.0390799999999781 | 0.2 |
| 0.0400899999999781 | 0.2 |
| 0.0410999999999781 | 0.2 |
| 0.0421099999999781 | 0.2 |
| 0.0431199999999781 | 0.2 |
| 0.0441299999999781 | 0.2 |
| 0.0451399999999781 | 0.2 |
| 0.0461499999999781 | 0.2 |
| 0.0471599999999781 | 0.2 |
| 0.048169999999978 | 0.2 |
| 0.049179999999978 | 0.2 |
| 0.050189999999978 | 0.2 |
| 0.051199999999978 | 0.2 |
| 0.052209999999978 | 0.2 |
| 0.053219999999978 | 0.2 |
| 0.054229999999978 | 0.2 |
| 0.055239999999978 | 0.2 |
| 0.056249999999978 | 0.2 |
| 0.057259999999978 | 0.2 |
| 0.058269999999978 | 0.2 |
| 0.059279999999978 | 0.2 |
| 0.060289999999978 | 0.2 |
| 0.061299999999978 | 0.2 |
| 0.062309999999978 | 0.2 |
| 0.063319999999978 | 0.2 |
| 0.064329999999978 | 0.2 |
| 0.065339999999978 | 0.2 |
| 0.066349999999978 | 0.2 |
| 0.067359999999978 | 0.2 |
| 0.068369999999978 | 0.2 |
| 0.069379999999978 | 0.2 |
| 0.070389999999978 | 0.2 |
| 0.071399999999978 | 0.2 |
| 0.072409999999978 | 0.2 |
| 0.073419999999978 | 0.2 |
| 0.074429999999978 | 0.2 |
| 0.075439999999978 | 0.2 |
| 0.076449999999978 | 0.2 |
| 0.077459999999978 | 0.2 |
| 0.078469999999978 | 0.2 |
| 0.079479999999978 | 0.201 |
| 0.080489999999978 | 0.201 |
| 0.0814999999999779 | 0.201 |
| 0.0825099999999779 | 0.201 |
| 0.0835199999999779 | 0.201 |
| 0.0845299999999779 | 0.201 |
| 0.0855399999999779 | 0.201 |
| 0.0865499999999779 | 0.201 |
| 0.0875599999999779 | 0.201 |
| 0.0885699999999779 | 0.201 |
| 0.0895799999999779 | 0.201 |
| 0.0905899999999779 | 0.201 |
| 0.0915999999999779 | 0.201 |
| 0.0926099999999779 | 0.201 |
| 0.0936199999999779 | 0.201 |
| 0.0946299999999779 | 0.201 |
| 0.0956399999999779 | 0.201 |
| 0.0966499999999779 | 0.201 |
| 0.0976599999999779 | 0.201 |
| 0.0986699999999779 | 0.201 |
| 0.0996799999999779 | 0.201 |
| 0.100689999999978 | 0.201 |
| 0.101699999999978 | 0.201 |
| 0.102709999999978 | 0.201 |
| 0.103719999999978 | 0.201 |
| 0.104729999999978 | 0.201 |
| 0.105739999999978 | 0.201 |
| 0.106749999999978 | 0.201 |
| 0.107759999999978 | 0.201 |
| 0.108769999999978 | 0.201 |
| 0.109779999999978 | 0.201 |
| 0.110789999999978 | 0.201 |
| 0.111799999999978 | 0.201 |
| 0.112809999999978 | 0.201 |
| 0.113819999999978 | 0.201 |
| 0.114829999999978 | 0.202 |
| 0.115839999999978 | 0.202 |
| 0.116849999999978 | 0.202 |
| 0.117859999999978 | 0.202 |
| 0.118869999999978 | 0.202 |
| 0.119879999999978 | 0.202 |
| 0.120889999999978 | 0.202 |
| 0.121899999999978 | 0.202 |
| 0.122909999999978 | 0.202 |
| 0.123919999999978 | 0.202 |
| 0.124929999999978 | 0.202 |
| 0.125939999999978 | 0.202 |
| 0.126949999999978 | 0.202 |
| 0.127959999999978 | 0.202 |
| 0.128969999999978 | 0.202 |
| 0.129979999999978 | 0.202 |
| 0.130989999999978 | 0.202 |
| 0.131999999999978 | 0.202 |
| 0.133009999999978 | 0.202 |
| 0.134019999999978 | 0.202 |
| 0.135029999999978 | 0.202 |
| 0.136039999999978 | 0.203 |
| 0.137049999999978 | 0.203 |
| 0.138059999999978 | 0.203 |
| 0.139069999999978 | 0.203 |
| 0.140079999999978 | 0.203 |
| 0.141089999999978 | 0.203 |
| 0.142099999999978 | 0.203 |
| 0.143109999999978 | 0.203 |
| 0.144119999999978 | 0.203 |
| 0.145129999999978 | 0.203 |
| 0.146139999999978 | 0.203 |
| 0.147149999999978 | 0.203 |
| 0.148159999999978 | 0.203 |
| 0.149169999999978 | 0.203 |
| 0.150179999999978 | 0.203 |
| 0.151189999999978 | 0.203 |
| 0.152199999999978 | 0.204 |
| 0.153209999999978 | 0.204 |
| 0.154219999999978 | 0.204 |
| 0.155229999999978 | 0.204 |
| 0.156239999999978 | 0.204 |
| 0.157249999999978 | 0.204 |
| 0.158259999999978 | 0.204 |
| 0.159269999999978 | 0.204 |
| 0.160279999999978 | 0.204 |
| 0.161289999999978 | 0.204 |
| 0.162299999999978 | 0.204 |
| 0.163309999999978 | 0.204 |
| 0.164319999999978 | 0.204 |
| 0.165329999999978 | 0.205 |
| 0.166339999999978 | 0.205 |
| 0.167349999999978 | 0.205 |
| 0.168359999999978 | 0.205 |
| 0.169369999999978 | 0.205 |
| 0.170379999999978 | 0.205 |
| 0.171389999999978 | 0.205 |
| 0.172399999999978 | 0.205 |
| 0.173409999999978 | 0.205 |
| 0.174419999999978 | 0.205 |
| 0.175429999999978 | 0.205 |
| 0.176439999999978 | 0.205 |
| 0.177449999999978 | 0.206 |
| 0.178459999999978 | 0.206 |
| 0.179469999999978 | 0.206 |
| 0.180479999999978 | 0.206 |
| 0.181489999999978 | 0.206 |
| 0.182499999999978 | 0.206 |
| 0.183509999999978 | 0.206 |
| 0.184519999999978 | 0.206 |
| 0.185529999999978 | 0.206 |
| 0.186539999999978 | 0.206 |
| 0.187549999999978 | 0.207 |
| 0.188559999999978 | 0.207 |
| 0.189569999999979 | 0.207 |
| 0.190579999999979 | 0.207 |
| 0.191589999999979 | 0.207 |
| 0.192599999999979 | 0.207 |
| 0.193609999999979 | 0.207 |
| 0.194619999999979 | 0.207 |
| 0.195629999999979 | 0.207 |
| 0.196639999999979 | 0.208 |
| 0.197649999999979 | 0.208 |
| 0.198659999999979 | 0.208 |
| 0.199669999999979 | 0.208 |
| 0.200679999999979 | 0.208 |
| 0.201689999999979 | 0.208 |
| 0.202699999999979 | 0.208 |
| 0.203709999999979 | 0.208 |
| 0.204719999999979 | 0.209 |
| 0.205729999999979 | 0.209 |
| 0.206739999999979 | 0.209 |
| 0.207749999999979 | 0.209 |
| 0.208759999999979 | 0.209 |
| 0.209769999999979 | 0.209 |
| 0.210779999999979 | 0.209 |
| 0.211789999999979 | 0.209 |
| 0.212799999999979 | 0.21 |
| 0.213809999999979 | 0.21 |
| 0.214819999999979 | 0.21 |
| 0.215829999999979 | 0.21 |
| 0.216839999999979 | 0.21 |
| 0.217849999999979 | 0.21 |
| 0.218859999999979 | 0.21 |
| 0.219869999999979 | 0.211 |
| 0.220879999999979 | 0.211 |
| 0.221889999999979 | 0.211 |
| 0.222899999999979 | 0.211 |
| 0.223909999999979 | 0.211 |
| 0.224919999999979 | 0.211 |
| 0.225929999999979 | 0.212 |
| 0.226939999999979 | 0.212 |
| 0.227949999999979 | 0.212 |
| 0.228959999999979 | 0.212 |
| 0.229969999999979 | 0.212 |
| 0.230979999999979 | 0.212 |
| 0.231989999999979 | 0.212 |
| 0.232999999999979 | 0.213 |
| 0.234009999999979 | 0.213 |
| 0.235019999999979 | 0.213 |
| 0.236029999999979 | 0.213 |
| 0.237039999999979 | 0.213 |
| 0.238049999999979 | 0.213 |
| 0.239059999999979 | 0.214 |
| 0.240069999999979 | 0.214 |
| 0.241079999999979 | 0.214 |
| 0.242089999999979 | 0.214 |
| 0.243099999999979 | 0.214 |
| 0.244109999999979 | 0.215 |
| 0.245119999999979 | 0.215 |
| 0.246129999999979 | 0.215 |
| 0.247139999999979 | 0.215 |
| 0.248149999999979 | 0.215 |
| 0.249159999999979 | 0.215 |
| 0.250169999999979 | 0.216 |
| 0.251179999999979 | 0.216 |
| 0.252189999999979 | 0.216 |
| 0.253199999999979 | 0.216 |
| 0.254209999999979 | 0.216 |
| 0.255219999999979 | 0.217 |
| 0.256229999999979 | 0.217 |
| 0.257239999999979 | 0.217 |
| 0.258249999999979 | 0.217 |
| 0.259259999999979 | 0.217 |
| 0.260269999999979 | 0.218 |
| 0.261279999999979 | 0.218 |
| 0.262289999999979 | 0.218 |
| 0.263299999999979 | 0.218 |
| 0.264309999999979 | 0.218 |
| 0.265319999999979 | 0.219 |
| 0.266329999999979 | 0.219 |
| 0.267339999999979 | 0.219 |
| 0.268349999999979 | 0.219 |
| 0.269359999999979 | 0.22 |
| 0.270369999999979 | 0.22 |
| 0.271379999999979 | 0.22 |
| 0.272389999999979 | 0.22 |
| 0.273399999999979 | 0.22 |
| 0.274409999999979 | 0.221 |
| 0.275419999999979 | 0.221 |
| 0.276429999999979 | 0.221 |
| 0.277439999999979 | 0.221 |
| 0.278449999999979 | 0.222 |
| 0.279459999999979 | 0.222 |
| 0.280469999999979 | 0.222 |
| 0.281479999999979 | 0.222 |
| 0.28248999999998 | 0.223 |
| 0.28349999999998 | 0.223 |
| 0.28450999999998 | 0.223 |
| 0.28551999999998 | 0.223 |
| 0.28652999999998 | 0.224 |
| 0.28753999999998 | 0.224 |
| 0.28854999999998 | 0.224 |
| 0.28955999999998 | 0.224 |
| 0.29056999999998 | 0.225 |
| 0.29157999999998 | 0.225 |
| 0.29258999999998 | 0.225 |
| 0.29359999999998 | 0.225 |
| 0.29460999999998 | 0.226 |
| 0.29561999999998 | 0.226 |
| 0.29662999999998 | 0.226 |
| 0.29763999999998 | 0.226 |
| 0.29864999999998 | 0.227 |
| 0.29965999999998 | 0.227 |
| 0.30066999999998 | 0.227 |
| 0.30167999999998 | 0.227 |
| 0.30268999999998 | 0.228 |
| 0.30369999999998 | 0.228 |
| 0.30470999999998 | 0.228 |
| 0.30571999999998 | 0.229 |
| 0.30672999999998 | 0.229 |
| 0.30773999999998 | 0.229 |
| 0.30874999999998 | 0.229 |
| 0.30975999999998 | 0.23 |
| 0.31076999999998 | 0.23 |
| 0.31177999999998 | 0.23 |
| 0.31278999999998 | 0.231 |
| 0.31379999999998 | 0.231 |
| 0.31480999999998 | 0.231 |
| 0.31581999999998 | 0.232 |
| 0.31682999999998 | 0.232 |
| 0.31783999999998 | 0.232 |
| 0.31884999999998 | 0.232 |
| 0.31985999999998 | 0.233 |
| 0.32086999999998 | 0.233 |
| 0.32187999999998 | 0.233 |
| 0.32288999999998 | 0.234 |
| 0.32389999999998 | 0.234 |
| 0.32490999999998 | 0.234 |
| 0.32591999999998 | 0.235 |
| 0.32692999999998 | 0.235 |
| 0.32793999999998 | 0.235 |
| 0.32894999999998 | 0.236 |
| 0.32995999999998 | 0.236 |
| 0.33096999999998 | 0.236 |
| 0.33197999999998 | 0.237 |
| 0.33298999999998 | 0.237 |
| 0.33399999999998 | 0.237 |
| 0.33500999999998 | 0.238 |
| 0.33601999999998 | 0.238 |
| 0.33702999999998 | 0.238 |
| 0.33803999999998 | 0.239 |
| 0.33904999999998 | 0.239 |
| 0.34005999999998 | 0.239 |
| 0.34106999999998 | 0.24 |
| 0.34207999999998 | 0.24 |
| 0.34308999999998 | 0.24 |
| 0.34409999999998 | 0.241 |
| 0.34510999999998 | 0.241 |
| 0.34611999999998 | 0.241 |
| 0.34712999999998 | 0.242 |
| 0.34813999999998 | 0.242 |
| 0.34914999999998 | 0.243 |
| 0.35015999999998 | 0.243 |
| 0.35116999999998 | 0.243 |
| 0.35217999999998 | 0.244 |
| 0.35318999999998 | 0.244 |
| 0.35419999999998 | 0.244 |
| 0.35520999999998 | 0.245 |
| 0.35621999999998 | 0.245 |
| 0.35722999999998 | 0.246 |
| 0.35823999999998 | 0.246 |
| 0.35924999999998 | 0.246 |
| 0.36025999999998 | 0.247 |
| 0.36126999999998 | 0.247 |
| 0.36227999999998 | 0.248 |
| 0.36328999999998 | 0.248 |
| 0.36429999999998 | 0.248 |
| 0.36530999999998 | 0.249 |
| 0.36631999999998 | 0.249 |
| 0.36732999999998 | 0.25 |
| 0.36833999999998 | 0.25 |
| 0.36934999999998 | 0.25 |
| 0.37035999999998 | 0.251 |
| 0.37136999999998 | 0.251 |
| 0.37237999999998 | 0.252 |
| 0.37338999999998 | 0.252 |
| 0.37439999999998 | 0.252 |
| 0.37540999999998 | 0.253 |
| 0.37641999999998 | 0.253 |
| 0.377429999999981 | 0.254 |
| 0.378439999999981 | 0.254 |
| 0.379449999999981 | 0.255 |
| 0.380459999999981 | 0.255 |
| 0.381469999999981 | 0.256 |
| 0.382479999999981 | 0.256 |
| 0.383489999999981 | 0.256 |
| 0.384499999999981 | 0.257 |
| 0.385509999999981 | 0.257 |
| 0.386519999999981 | 0.258 |
| 0.387529999999981 | 0.258 |
| 0.388539999999981 | 0.259 |
| 0.389549999999981 | 0.259 |
| 0.390559999999981 | 0.26 |
| 0.391569999999981 | 0.26 |
| 0.392579999999981 | 0.261 |
| 0.393589999999981 | 0.261 |
| 0.394599999999981 | 0.261 |
| 0.395609999999981 | 0.262 |
| 0.396619999999981 | 0.262 |
| 0.397629999999981 | 0.263 |
| 0.398639999999981 | 0.263 |
| 0.399649999999981 | 0.264 |
| 0.400659999999981 | 0.264 |
| 0.401669999999981 | 0.265 |
| 0.402679999999981 | 0.265 |
| 0.403689999999981 | 0.266 |
| 0.404699999999981 | 0.266 |
| 0.405709999999981 | 0.267 |
| 0.406719999999981 | 0.267 |
| 0.407729999999981 | 0.268 |
| 0.408739999999981 | 0.268 |
| 0.409749999999981 | 0.269 |
| 0.410759999999981 | 0.269 |
| 0.411769999999981 | 0.27 |
| 0.412779999999981 | 0.27 |
| 0.413789999999981 | 0.271 |
| 0.414799999999981 | 0.271 |
| 0.415809999999981 | 0.272 |
| 0.416819999999981 | 0.272 |
| 0.417829999999981 | 0.273 |
| 0.418839999999981 | 0.273 |
| 0.419849999999981 | 0.274 |
| 0.420859999999981 | 0.275 |
| 0.421869999999981 | 0.275 |
| 0.422879999999981 | 0.276 |
| 0.423889999999981 | 0.276 |
| 0.424899999999981 | 0.277 |
| 0.425909999999981 | 0.277 |
| 0.426919999999981 | 0.278 |
| 0.427929999999981 | 0.278 |
| 0.428939999999981 | 0.279 |
| 0.429949999999981 | 0.279 |
| 0.430959999999981 | 0.28 |
| 0.431969999999981 | 0.281 |
| 0.432979999999981 | 0.281 |
| 0.433989999999981 | 0.282 |
| 0.434999999999981 | 0.282 |
| 0.436009999999981 | 0.283 |
| 0.437019999999981 | 0.283 |
| 0.438029999999981 | 0.284 |
| 0.439039999999981 | 0.285 |
| 0.440049999999981 | 0.285 |
| 0.441059999999981 | 0.286 |
| 0.442069999999981 | 0.286 |
| 0.443079999999981 | 0.287 |
| 0.444089999999981 | 0.288 |
| 0.445099999999981 | 0.288 |
| 0.446109999999981 | 0.289 |
| 0.447119999999981 | 0.289 |
| 0.448129999999981 | 0.29 |
| 0.449139999999981 | 0.291 |
| 0.450149999999981 | 0.291 |
| 0.451159999999981 | 0.292 |
| 0.452169999999981 | 0.292 |
| 0.453179999999981 | 0.293 |
| 0.454189999999981 | 0.294 |
| 0.455199999999981 | 0.294 |
| 0.456209999999981 | 0.295 |
| 0.457219999999981 | 0.296 |
| 0.458229999999981 | 0.296 |
| 0.459239999999981 | 0.297 |
| 0.460249999999981 | 0.297 |
| 0.461259999999981 | 0.298 |
| 0.462269999999981 | 0.299 |
| 0.463279999999981 | 0.299 |
| 0.464289999999981 | 0.3 |
| 0.465299999999981 | 0.301 |
| 0.466309999999981 | 0.301 |
| 0.467319999999981 | 0.302 |
| 0.468329999999982 | 0.303 |
| 0.469339999999982 | 0.303 |
| 0.470349999999982 | 0.304 |
| 0.471359999999982 | 0.305 |
| 0.472369999999982 | 0.305 |
| 0.473379999999982 | 0.306 |
| 0.474389999999982 | 0.307 |
| 0.475399999999982 | 0.307 |
| 0.476409999999982 | 0.308 |
| 0.477419999999982 | 0.309 |
| 0.478429999999982 | 0.31 |
| 0.479439999999982 | 0.31 |
| 0.480449999999982 | 0.311 |
| 0.481459999999982 | 0.312 |
| 0.482469999999982 | 0.312 |
| 0.483479999999982 | 0.313 |
| 0.484489999999982 | 0.314 |
| 0.485499999999982 | 0.314 |
| 0.486509999999982 | 0.315 |
| 0.487519999999982 | 0.316 |
| 0.488529999999982 | 0.317 |
| 0.489539999999982 | 0.317 |
| 0.490549999999982 | 0.318 |
| 0.491559999999982 | 0.319 |
| 0.492569999999982 | 0.32 |
| 0.493579999999982 | 0.32 |
| 0.494589999999982 | 0.321 |
| 0.495599999999982 | 0.322 |
| 0.496609999999982 | 0.322 |
| 0.497619999999982 | 0.323 |
| 0.498629999999982 | 0.324 |
| 0.499639999999982 | 0.325 |
| 0.500649999999982 | 0.325 |
| 0.501659999999982 | 0.326 |
| 0.502669999999982 | 0.327 |
| 0.503679999999982 | 0.328 |
| 0.504689999999982 | 0.329 |
| 0.505699999999982 | 0.329 |
| 0.506709999999982 | 0.33 |
| 0.507719999999982 | 0.331 |
| 0.508729999999981 | 0.332 |
| 0.509739999999981 | 0.332 |
| 0.510749999999981 | 0.333 |
| 0.511759999999981 | 0.334 |
| 0.512769999999981 | 0.335 |
| 0.513779999999981 | 0.336 |
| 0.514789999999981 | 0.336 |
| 0.515799999999981 | 0.337 |
| 0.516809999999981 | 0.338 |
| 0.517819999999981 | 0.339 |
| 0.518829999999981 | 0.34 |
| 0.519839999999981 | 0.34 |
| 0.520849999999981 | 0.341 |
| 0.521859999999981 | 0.342 |
| 0.522869999999981 | 0.343 |
| 0.523879999999981 | 0.344 |
| 0.524889999999981 | 0.345 |
| 0.525899999999981 | 0.345 |
| 0.526909999999981 | 0.346 |
| 0.527919999999981 | 0.347 |
| 0.528929999999981 | 0.348 |
| 0.529939999999981 | 0.349 |
| 0.53094999999998 | 0.35 |
| 0.53195999999998 | 0.351 |
| 0.53296999999998 | 0.351 |
| 0.53397999999998 | 0.352 |
| 0.53498999999998 | 0.353 |
| 0.53599999999998 | 0.354 |
| 0.53700999999998 | 0.355 |
| 0.53801999999998 | 0.356 |
| 0.53902999999998 | 0.357 |
| 0.54003999999998 | 0.357 |
| 0.54104999999998 | 0.358 |
| 0.54205999999998 | 0.359 |
| 0.54306999999998 | 0.36 |
| 0.54407999999998 | 0.361 |
| 0.54508999999998 | 0.362 |
| 0.54609999999998 | 0.363 |
| 0.54710999999998 | 0.364 |
| 0.54811999999998 | 0.365 |
| 0.54912999999998 | 0.366 |
| 0.55013999999998 | 0.367 |
| 0.55114999999998 | 0.367 |
| 0.55215999999998 | 0.368 |
| 0.55316999999998 | 0.369 |
| 0.554179999999979 | 0.37 |
| 0.555189999999979 | 0.371 |
| 0.556199999999979 | 0.372 |
| 0.557209999999979 | 0.373 |
| 0.558219999999979 | 0.374 |
| 0.559229999999979 | 0.375 |
| 0.560239999999979 | 0.376 |
| 0.561249999999979 | 0.377 |
| 0.562259999999979 | 0.378 |
| 0.563269999999979 | 0.379 |
| 0.564279999999979 | 0.38 |
| 0.565289999999979 | 0.381 |
| 0.566299999999979 | 0.382 |
| 0.567309999999979 | 0.383 |
| 0.568319999999979 | 0.384 |
| 0.569329999999979 | 0.385 |
| 0.570339999999979 | 0.386 |
| 0.571349999999979 | 0.387 |
| 0.572359999999979 | 0.388 |
| 0.573369999999979 | 0.388 |
| 0.574379999999979 | 0.389 |
| 0.575389999999979 | 0.39 |
| 0.576399999999978 | 0.392 |
| 0.577409999999978 | 0.393 |
| 0.578419999999978 | 0.394 |
| 0.579429999999978 | 0.395 |
| 0.580439999999978 | 0.396 |
| 0.581449999999978 | 0.397 |
| 0.582459999999978 | 0.398 |
| 0.583469999999978 | 0.399 |
| 0.584479999999978 | 0.4 |
| 0.585489999999978 | 0.401 |
| 0.586499999999978 | 0.402 |
| 0.587509999999978 | 0.403 |
| 0.588519999999978 | 0.404 |
| 0.589529999999978 | 0.405 |
| 0.590539999999978 | 0.406 |
| 0.591549999999978 | 0.407 |
| 0.592559999999978 | 0.408 |
| 0.593569999999978 | 0.409 |
| 0.594579999999978 | 0.41 |
| 0.595589999999978 | 0.411 |
| 0.596599999999978 | 0.412 |
| 0.597609999999978 | 0.413 |
| 0.598619999999977 | 0.415 |
| 0.599629999999977 | 0.416 |
| 0.600639999999977 | 0.417 |
| 0.601649999999977 | 0.418 |
| 0.602659999999977 | 0.419 |
| 0.603669999999977 | 0.42 |
| 0.604679999999977 | 0.421 |
| 0.605689999999977 | 0.422 |
| 0.606699999999977 | 0.423 |
| 0.607709999999977 | 0.424 |
| 0.608719999999977 | 0.426 |
| 0.609729999999977 | 0.427 |
| 0.610739999999977 | 0.428 |
| 0.611749999999977 | 0.429 |
| 0.612759999999977 | 0.43 |
| 0.613769999999977 | 0.431 |
| 0.614779999999977 | 0.432 |
| 0.615789999999977 | 0.434 |
| 0.616799999999977 | 0.435 |
| 0.617809999999977 | 0.436 |
| 0.618819999999977 | 0.437 |
| 0.619829999999976 | 0.438 |
| 0.620839999999976 | 0.439 |
| 0.621849999999976 | 0.44 |
| 0.622859999999976 | 0.442 |
| 0.623869999999976 | 0.443 |
| 0.624879999999976 | 0.444 |
| 0.625889999999976 | 0.445 |
| 0.626899999999976 | 0.446 |
| 0.627909999999976 | 0.448 |
| 0.628919999999976 | 0.449 |
| 0.629929999999976 | 0.45 |
| 0.630939999999976 | 0.451 |
| 0.631949999999976 | 0.452 |
| 0.632959999999976 | 0.454 |
| 0.633969999999976 | 0.455 |
| 0.634979999999976 | 0.456 |
| 0.635989999999976 | 0.457 |
| 0.636999999999976 | 0.458 |
| 0.638009999999976 | 0.46 |
| 0.639019999999976 | 0.461 |
| 0.640029999999976 | 0.462 |
| 0.641039999999976 | 0.463 |
| 0.642049999999975 | 0.465 |
| 0.643059999999975 | 0.466 |
| 0.644069999999975 | 0.467 |
| 0.645079999999975 | 0.468 |
| 0.646089999999975 | 0.47 |
| 0.647099999999975 | 0.471 |
| 0.648109999999975 | 0.472 |
| 0.649119999999975 | 0.474 |
| 0.650129999999975 | 0.475 |
| 0.651139999999975 | 0.476 |
| 0.652149999999975 | 0.477 |
| 0.653159999999975 | 0.479 |
| 0.654169999999975 | 0.48 |
| 0.655179999999975 | 0.481 |
| 0.656189999999975 | 0.483 |
| 0.657199999999975 | 0.484 |
| 0.658209999999975 | 0.485 |
| 0.659219999999975 | 0.486 |
| 0.660229999999975 | 0.488 |
| 0.661239999999975 | 0.489 |
| 0.662249999999975 | 0.49 |
| 0.663259999999975 | 0.492 |
| 0.664269999999975 | 0.493 |
| 0.665279999999974 | 0.494 |
| 0.666289999999974 | 0.496 |
| 0.667299999999974 | 0.497 |
| 0.668309999999974 | 0.498 |
| 0.669319999999974 | 0.5 |
| 0.670329999999974 | 0.501 |
| 0.671339999999974 | 0.503 |
| 0.672349999999974 | 0.504 |
| 0.673359999999974 | 0.505 |
| 0.674369999999974 | 0.507 |
| 0.675379999999974 | 0.508 |
| 0.676389999999974 | 0.509 |
| 0.677399999999974 | 0.511 |
| 0.678409999999974 | 0.512 |
| 0.679419999999974 | 0.514 |
| 0.680429999999974 | 0.515 |
| 0.681439999999974 | 0.516 |
| 0.682449999999974 | 0.518 |
| 0.683459999999974 | 0.519 |
| 0.684469999999974 | 0.521 |
| 0.685479999999974 | 0.522 |
| 0.686489999999974 | 0.524 |
| 0.687499999999973 | 0.525 |
| 0.688509999999973 | 0.526 |
| 0.689519999999973 | 0.528 |
| 0.690529999999973 | 0.529 |
| 0.691539999999973 | 0.531 |
| 0.692549999999973 | 0.532 |
| 0.693559999999973 | 0.534 |
| 0.694569999999973 | 0.535 |
| 0.695579999999973 | 0.537 |
| 0.696589999999973 | 0.538 |
| 0.697599999999973 | 0.539 |
| 0.698609999999973 | 0.541 |
| 0.699619999999973 | 0.542 |
| 0.700629999999973 | 0.544 |
| 0.701639999999973 | 0.545 |
| 0.702649999999973 | 0.547 |
| 0.703659999999973 | 0.548 |
| 0.704669999999973 | 0.55 |
| 0.705679999999973 | 0.551 |
| 0.706689999999973 | 0.553 |
| 0.707699999999973 | 0.554 |
| 0.708709999999973 | 0.556 |
| 0.709719999999973 | 0.557 |
| 0.710729999999972 | 0.559 |
| 0.711739999999972 | 0.561 |
| 0.712749999999972 | 0.562 |
| 0.713759999999972 | 0.564 |
| 0.714769999999972 | 0.565 |
| 0.715779999999972 | 0.567 |
| 0.716789999999972 | 0.568 |
| 0.717799999999972 | 0.57 |
| 0.718809999999972 | 0.571 |
| 0.719819999999972 | 0.573 |
| 0.720829999999972 | 0.575 |
| 0.721839999999972 | 0.576 |
| 0.722849999999972 | 0.578 |
| 0.723859999999972 | 0.579 |
| 0.724869999999972 | 0.581 |
| 0.725879999999972 | 0.582 |
| 0.726889999999972 | 0.584 |
| 0.727899999999972 | 0.586 |
| 0.728909999999972 | 0.587 |
| 0.729919999999972 | 0.589 |
| 0.730929999999972 | 0.591 |
| 0.731939999999972 | 0.592 |
| 0.732949999999971 | 0.594 |
| 0.733959999999971 | 0.595 |
| 0.734969999999971 | 0.597 |
| 0.735979999999971 | 0.599 |
| 0.736989999999971 | 0.6 |
| 0.737999999999971 | 0.602 |
| 0.739009999999971 | 0.604 |
| 0.740019999999971 | 0.605 |
| 0.741029999999971 | 0.607 |
| 0.742039999999971 | 0.609 |
| 0.743049999999971 | 0.61 |
| 0.744059999999971 | 0.612 |
| 0.745069999999971 | 0.614 |
| 0.746079999999971 | 0.615 |
| 0.747089999999971 | 0.617 |
| 0.748099999999971 | 0.619 |
| 0.749109999999971 | 0.62 |
| 0.750119999999971 | 0.622 |
| 0.751129999999971 | 0.624 |
| 0.752139999999971 | 0.625 |
| 0.753149999999971 | 0.627 |
| 0.754159999999971 | 0.629 |
| 0.755169999999971 | 0.631 |
| 0.75617999999997 | 0.632 |
| 0.75718999999997 | 0.634 |
| 0.75819999999997 | 0.636 |
| 0.75920999999997 | 0.638 |
| 0.76021999999997 | 0.639 |
| 0.76122999999997 | 0.641 |
| 0.76223999999997 | 0.643 |
| 0.76324999999997 | 0.645 |
| 0.76425999999997 | 0.646 |
| 0.76526999999997 | 0.648 |
| 0.76627999999997 | 0.65 |
| 0.76728999999997 | 0.652 |
| 0.76829999999997 | 0.654 |
| 0.76930999999997 | 0.655 |
| 0.77031999999997 | 0.657 |
| 0.77132999999997 | 0.659 |
| 0.77233999999997 | 0.661 |
| 0.77334999999997 | 0.663 |
| 0.77435999999997 | 0.664 |
| 0.77536999999997 | 0.666 |
| 0.77637999999997 | 0.668 |
| 0.77738999999997 | 0.67 |
| 0.778399999999969 | 0.672 |
| 0.779409999999969 | 0.673 |
| 0.780419999999969 | 0.675 |
| 0.781429999999969 | 0.677 |
| 0.782439999999969 | 0.679 |
| 0.783449999999969 | 0.681 |
| 0.784459999999969 | 0.683 |
| 0.785469999999969 | 0.685 |
| 0.786479999999969 | 0.686 |
| 0.787489999999969 | 0.688 |
| 0.788499999999969 | 0.69 |
| 0.789509999999969 | 0.692 |
| 0.790519999999969 | 0.694 |
| 0.791529999999969 | 0.696 |
| 0.792539999999969 | 0.698 |
| 0.793549999999969 | 0.7 |
| 0.794559999999969 | 0.702 |
| 0.795569999999969 | 0.704 |
| 0.796579999999969 | 0.705 |
| 0.797589999999969 | 0.707 |
| 0.798599999999969 | 0.709 |
| 0.799609999999969 | 0.711 |
| 0.800619999999969 | 0.713 |
| 0.801629999999968 | 0.715 |
| 0.802639999999968 | 0.717 |
| 0.803649999999968 | 0.719 |
| 0.804659999999968 | 0.721 |
| 0.805669999999968 | 0.723 |
| 0.806679999999968 | 0.725 |
| 0.807689999999968 | 0.727 |
| 0.808699999999968 | 0.729 |
| 0.809709999999968 | 0.731 |
| 0.810719999999968 | 0.733 |
| 0.811729999999968 | 0.735 |
| 0.812739999999968 | 0.737 |
| 0.813749999999968 | 0.739 |
| 0.814759999999968 | 0.741 |
| 0.815769999999968 | 0.743 |
| 0.816779999999968 | 0.745 |
| 0.817789999999968 | 0.747 |
| 0.818799999999968 | 0.749 |
| 0.819809999999968 | 0.751 |
| 0.820819999999968 | 0.753 |
| 0.821829999999968 | 0.755 |
| 0.822839999999968 | 0.757 |
| 0.823849999999968 | 0.759 |
| 0.824859999999967 | 0.761 |
| 0.825869999999967 | 0.763 |
| 0.826879999999967 | 0.765 |
| 0.827889999999967 | 0.767 |
| 0.828899999999967 | 0.77 |
| 0.829909999999967 | 0.772 |
| 0.830919999999967 | 0.774 |
| 0.831929999999967 | 0.776 |
| 0.832939999999967 | 0.778 |
| 0.833949999999967 | 0.78 |
| 0.834959999999967 | 0.782 |
| 0.835969999999967 | 0.784 |
| 0.836979999999967 | 0.786 |
| 0.837989999999967 | 0.788 |
| 0.838999999999967 | 0.791 |
| 0.840009999999967 | 0.793 |
| 0.841019999999967 | 0.795 |
| 0.842029999999967 | 0.797 |
| 0.843039999999967 | 0.799 |
| 0.844049999999967 | 0.801 |
| 0.845059999999967 | 0.803 |
| 0.846069999999967 | 0.806 |
| 0.847079999999966 | 0.808 |
| 0.848089999999966 | 0.81 |
| 0.849099999999966 | 0.812 |
| 0.850109999999966 | 0.814 |
| 0.851119999999966 | 0.817 |
| 0.852129999999966 | 0.819 |
| 0.853139999999966 | 0.821 |
| 0.854149999999966 | 0.823 |
| 0.855159999999966 | 0.825 |
| 0.856169999999966 | 0.828 |
| 0.857179999999966 | 0.83 |
| 0.858189999999966 | 0.832 |
| 0.859199999999966 | 0.834 |
| 0.860209999999966 | 0.837 |
| 0.861219999999966 | 0.839 |
| 0.862229999999966 | 0.841 |
| 0.863239999999966 | 0.843 |
| 0.864249999999966 | 0.846 |
| 0.865259999999966 | 0.848 |
| 0.866269999999966 | 0.85 |
| 0.867279999999966 | 0.852 |
| 0.868289999999966 | 0.855 |
| 0.869299999999965 | 0.857 |
| 0.870309999999965 | 0.859 |
| 0.871319999999965 | 0.862 |
| 0.872329999999965 | 0.864 |
| 0.873339999999965 | 0.866 |
| 0.874349999999965 | 0.868 |
| 0.875359999999965 | 0.871 |
| 0.876369999999965 | 0.873 |
| 0.877379999999965 | 0.875 |
| 0.878389999999965 | 0.878 |
| 0.879399999999965 | 0.88 |
| 0.880409999999965 | 0.882 |
| 0.881419999999965 | 0.885 |
| 0.882429999999965 | 0.887 |
| 0.883439999999965 | 0.889 |
| 0.884449999999965 | 0.892 |
| 0.885459999999965 | 0.894 |
| 0.886469999999965 | 0.897 |
| 0.887479999999965 | 0.899 |
| 0.888489999999965 | 0.901 |
| 0.889499999999965 | 0.904 |
| 0.890509999999965 | 0.906 |
| 0.891519999999964 | 0.909 |
| 0.892529999999964 | 0.911 |
| 0.893539999999964 | 0.913 |
| 0.894549999999964 | 0.916 |
| 0.895559999999964 | 0.918 |
| 0.896569999999964 | 0.921 |
| 0.897579999999964 | 0.923 |
| 0.898589999999964 | 0.926 |
| 0.899599999999964 | 0.928 |
| 0.900609999999964 | 0.93 |
| 0.901619999999964 | 0.933 |
| 0.902629999999964 | 0.935 |
| 0.903639999999964 | 0.938 |
| 0.904649999999964 | 0.94 |
| 0.905659999999964 | 0.943 |
| 0.906669999999964 | 0.945 |
| 0.907679999999964 | 0.948 |
| 0.908689999999964 | 0.95 |
| 0.909699999999964 | 0.953 |
| 0.910709999999964 | 0.955 |
| 0.911719999999964 | 0.958 |
| 0.912729999999964 | 0.96 |
| 0.913739999999964 | 0.963 |
| 0.914749999999964 | 0.965 |
| 0.915759999999963 | 0.968 |
| 0.916769999999963 | 0.971 |
| 0.917779999999963 | 0.973 |
| 0.918789999999963 | 0.976 |
| 0.919799999999963 | 0.978 |
| 0.920809999999963 | 0.981 |
| 0.921819999999963 | 0.983 |
| 0.922829999999963 | 0.986 |
| 0.923839999999963 | 0.988 |
| 0.924849999999963 | 0.991 |
| 0.925859999999963 | 0.994 |
| 0.926869999999963 | 0.996 |
| 0.927879999999963 | 0.999 |
| 0.928889999999963 | 1.001 |
| 0.929899999999963 | 1.004 |
| 0.930909999999963 | 1.007 |
| 0.931919999999963 | 1.009 |
| 0.932929999999963 | 1.012 |
| 0.933939999999963 | 1.015 |
| 0.934949999999963 | 1.017 |
| 0.935959999999963 | 1.02 |
| 0.936969999999963 | 1.023 |
| 0.937979999999962 | 1.025 |
| 0.938989999999962 | 1.028 |
| 0.939999999999962 | 1.031 |